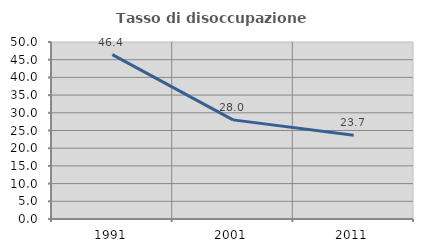
| Category | Tasso di disoccupazione giovanile  |
|---|---|
| 1991.0 | 46.429 |
| 2001.0 | 28 |
| 2011.0 | 23.684 |